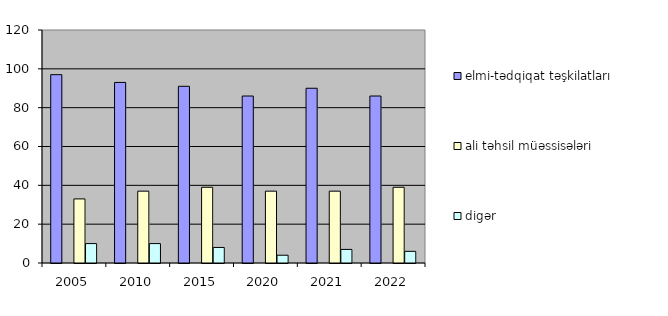
| Category | elmi-tədqiqat təşkilatları       | Series 1 | ali təhsil müəssisələri | digər  |
|---|---|---|---|---|
| 2005.0 | 97 |  | 33 | 10 |
| 2010.0 | 93 |  | 37 | 10 |
| 2015.0 | 91 |  | 39 | 8 |
| 2020.0 | 86 |  | 37 | 4 |
| 2021.0 | 90 |  | 37 | 7 |
| 2022.0 | 86 |  | 39 | 6 |